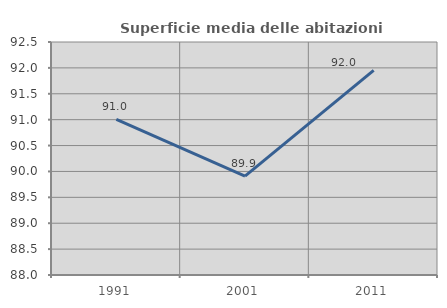
| Category | Superficie media delle abitazioni occupate |
|---|---|
| 1991.0 | 91.007 |
| 2001.0 | 89.909 |
| 2011.0 | 91.953 |